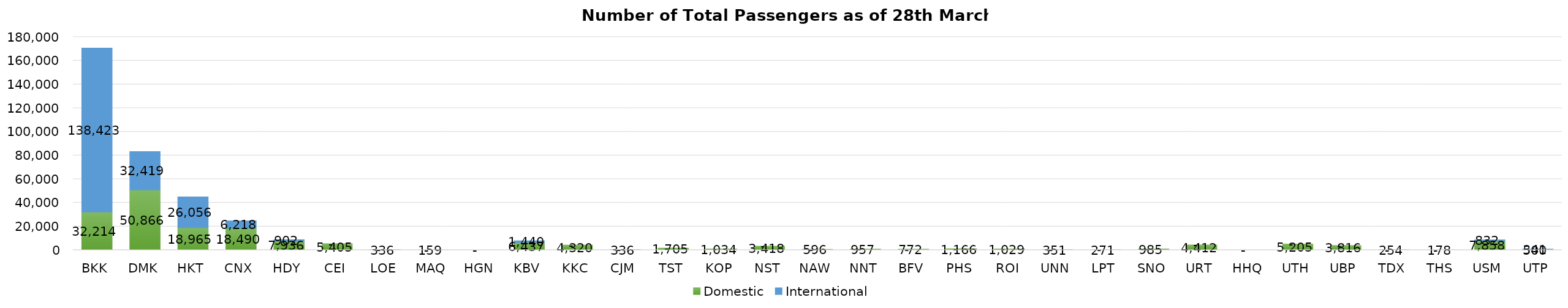
| Category | Domestic | International |
|---|---|---|
| BKK | 32214 | 138423 |
| DMK | 50866 | 32419 |
| HKT | 18965 | 26056 |
| CNX | 18490 | 6218 |
| HDY | 7936 | 902 |
| CEI | 5405 | 0 |
| LOE | 336 | 0 |
| MAQ | 159 | 0 |
| HGN | 0 | 0 |
| KBV | 6437 | 1440 |
| KKC | 4320 | 0 |
| CJM | 336 | 0 |
| TST | 1705 | 0 |
| KOP | 1034 | 0 |
| NST | 3418 | 0 |
| NAW | 596 | 0 |
| NNT | 957 | 0 |
| BFV | 772 | 0 |
| PHS | 1166 | 0 |
| ROI | 1029 | 0 |
| UNN | 351 | 0 |
| LPT | 271 | 0 |
| SNO | 985 | 0 |
| URT | 4412 | 0 |
| HHQ | 0 | 0 |
| UTH | 5205 | 0 |
| UBP | 3816 | 0 |
| TDX | 254 | 0 |
| THS | 178 | 0 |
| USM | 7858 | 832 |
| UTP | 500 | 341 |